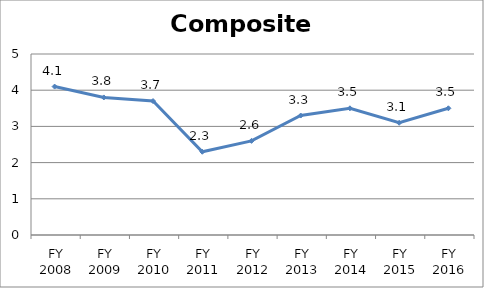
| Category | Composite score |
|---|---|
| FY 2016 | 3.5 |
| FY 2015 | 3.1 |
| FY 2014 | 3.5 |
| FY 2013 | 3.3 |
| FY 2012 | 2.6 |
| FY 2011 | 2.3 |
| FY 2010 | 3.7 |
| FY 2009 | 3.8 |
| FY 2008 | 4.1 |